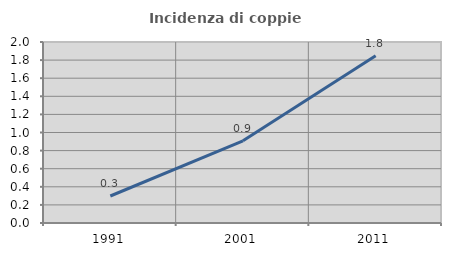
| Category | Incidenza di coppie miste |
|---|---|
| 1991.0 | 0.298 |
| 2001.0 | 0.908 |
| 2011.0 | 1.848 |